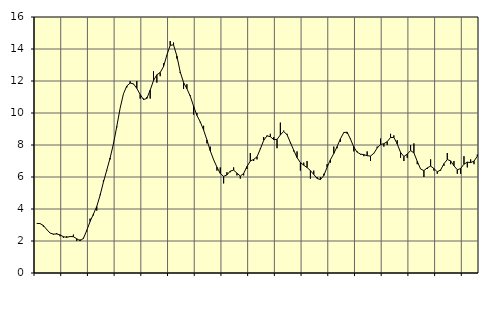
| Category | Piggar | Series 1 |
|---|---|---|
| nan | 3.1 | 3.1 |
| 87.0 | 3.1 | 3.09 |
| 87.0 | 2.9 | 2.97 |
| 87.0 | 2.7 | 2.72 |
| nan | 2.5 | 2.5 |
| 88.0 | 2.4 | 2.43 |
| 88.0 | 2.5 | 2.44 |
| 88.0 | 2.3 | 2.38 |
| nan | 2.2 | 2.27 |
| 89.0 | 2.3 | 2.23 |
| 89.0 | 2.3 | 2.28 |
| 89.0 | 2.4 | 2.27 |
| nan | 2 | 2.14 |
| 90.0 | 2.1 | 2.02 |
| 90.0 | 2.2 | 2.16 |
| 90.0 | 2.6 | 2.66 |
| nan | 3.4 | 3.22 |
| 91.0 | 3.6 | 3.68 |
| 91.0 | 3.9 | 4.16 |
| 91.0 | 4.9 | 4.86 |
| nan | 5.8 | 5.68 |
| 92.0 | 6.4 | 6.43 |
| 92.0 | 7.1 | 7.19 |
| 92.0 | 8.1 | 8.07 |
| nan | 9.1 | 9.16 |
| 93.0 | 10.3 | 10.3 |
| 93.0 | 11.2 | 11.2 |
| 93.0 | 11.6 | 11.69 |
| nan | 12 | 11.87 |
| 94.0 | 11.8 | 11.82 |
| 94.0 | 12 | 11.54 |
| 94.0 | 10.9 | 11.16 |
| nan | 10.9 | 10.84 |
| 95.0 | 11 | 10.91 |
| 95.0 | 10.9 | 11.43 |
| 95.0 | 12.6 | 12.03 |
| nan | 11.9 | 12.39 |
| 96.0 | 12.3 | 12.53 |
| 96.0 | 13.1 | 12.9 |
| 96.0 | 13.6 | 13.62 |
| nan | 14.5 | 14.23 |
| 97.0 | 14.4 | 14.26 |
| 97.0 | 13.4 | 13.56 |
| 97.0 | 12.5 | 12.57 |
| nan | 11.5 | 11.91 |
| 98.0 | 11.8 | 11.52 |
| 98.0 | 11.1 | 11.06 |
| 98.0 | 9.9 | 10.43 |
| nan | 10 | 9.85 |
| 99.0 | 9.4 | 9.45 |
| 99.0 | 9.2 | 8.94 |
| 99.0 | 8.1 | 8.32 |
| nan | 7.9 | 7.64 |
| 0.0 | 7.1 | 7.08 |
| 0.0 | 6.4 | 6.62 |
| 0.0 | 6.6 | 6.22 |
| nan | 5.6 | 6.04 |
| 1.0 | 6.3 | 6.13 |
| 1.0 | 6.3 | 6.37 |
| 1.0 | 6.6 | 6.43 |
| nan | 6.1 | 6.24 |
| 2.0 | 5.9 | 6.06 |
| 2.0 | 6.1 | 6.22 |
| 2.0 | 6.5 | 6.66 |
| nan | 7.5 | 7 |
| 3.0 | 7 | 7.1 |
| 3.0 | 7.1 | 7.26 |
| 3.0 | 7.8 | 7.75 |
| nan | 8.5 | 8.29 |
| 4.0 | 8.6 | 8.57 |
| 4.0 | 8.7 | 8.52 |
| 4.0 | 8.5 | 8.34 |
| nan | 7.8 | 8.35 |
| 5.0 | 9.4 | 8.63 |
| 5.0 | 8.9 | 8.85 |
| 5.0 | 8.7 | 8.64 |
| nan | 8.1 | 8.16 |
| 6.0 | 7.6 | 7.67 |
| 6.0 | 7.6 | 7.21 |
| 6.0 | 6.4 | 6.9 |
| nan | 6.9 | 6.74 |
| 7.0 | 7 | 6.59 |
| 7.0 | 5.9 | 6.4 |
| 7.0 | 6.4 | 6.16 |
| nan | 6 | 5.91 |
| 8.0 | 6 | 5.84 |
| 8.0 | 6.2 | 6.09 |
| 8.0 | 6.8 | 6.61 |
| nan | 6.9 | 7.08 |
| 9.0 | 7.9 | 7.47 |
| 9.0 | 7.8 | 7.9 |
| 9.0 | 8.2 | 8.39 |
| nan | 8.8 | 8.78 |
| 10.0 | 8.7 | 8.8 |
| 10.0 | 8.4 | 8.37 |
| 10.0 | 7.6 | 7.87 |
| nan | 7.6 | 7.55 |
| 11.0 | 7.4 | 7.43 |
| 11.0 | 7.3 | 7.4 |
| 11.0 | 7.6 | 7.33 |
| nan | 7 | 7.31 |
| 12.0 | 7.5 | 7.48 |
| 12.0 | 7.9 | 7.81 |
| 12.0 | 8.4 | 8.03 |
| nan | 7.9 | 8.08 |
| 13.0 | 8 | 8.21 |
| 13.0 | 8.7 | 8.47 |
| 13.0 | 8.6 | 8.47 |
| nan | 8.3 | 8.07 |
| 14.0 | 7.2 | 7.54 |
| 14.0 | 7 | 7.28 |
| 14.0 | 7.2 | 7.43 |
| nan | 8 | 7.65 |
| 15.0 | 8.1 | 7.51 |
| 15.0 | 6.8 | 6.98 |
| 15.0 | 6.5 | 6.5 |
| nan | 6 | 6.4 |
| 16.0 | 6.5 | 6.57 |
| 16.0 | 7.1 | 6.68 |
| 16.0 | 6.4 | 6.53 |
| nan | 6.2 | 6.32 |
| 17.0 | 6.4 | 6.44 |
| 17.0 | 6.7 | 6.83 |
| 17.0 | 7.5 | 7.09 |
| nan | 6.8 | 7.01 |
| 18.0 | 7 | 6.7 |
| 18.0 | 6.2 | 6.45 |
| 18.0 | 6.2 | 6.53 |
| nan | 7.3 | 6.8 |
| 19.0 | 6.6 | 6.93 |
| 19.0 | 7.1 | 6.9 |
| 19.0 | 6.8 | 6.99 |
| nan | 7.4 | 7.3 |